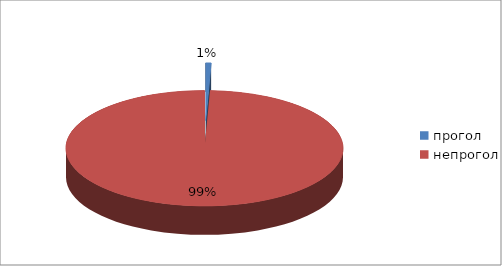
| Category | Series 0 |
|---|---|
| прогол | 9 |
| непрогол | 1411 |